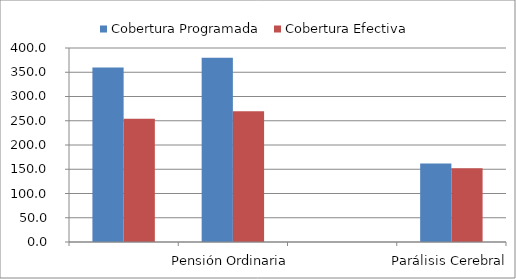
| Category | Cobertura Programada | Cobertura Efectiva |
|---|---|---|
|  | 359.568 | 254.227 |
| Pensión Ordinaria | 379.94 | 269.337 |
|  | 0 | 0 |
| Parálisis Cerebral | 161.72 | 151.931 |